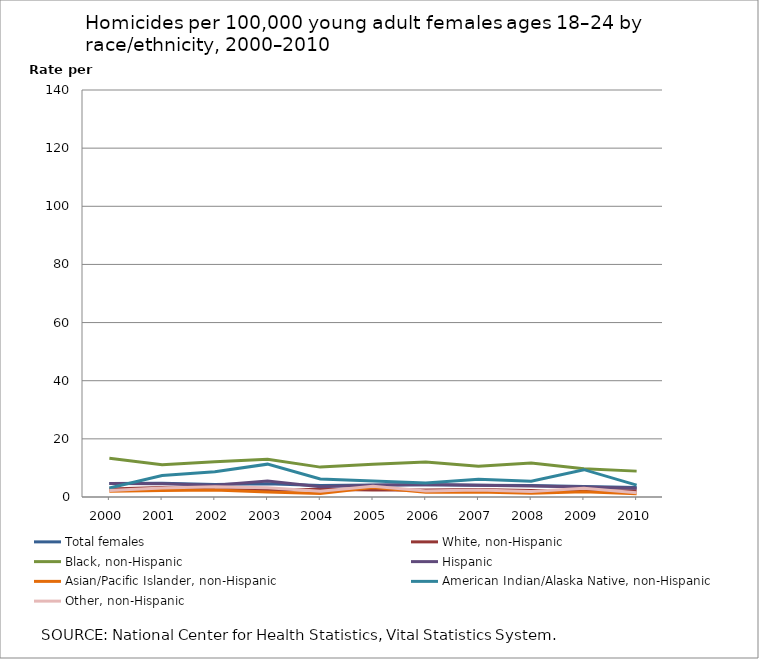
| Category | Total females | White, non-Hispanic | Black, non-Hispanic | Hispanic | Asian/Pacific Islander, non-Hispanic | American Indian/Alaska Native, non-Hispanic | Other, non-Hispanic |
|---|---|---|---|---|---|---|---|
| 2000.0 | 4.63 | 2.76 | 13.32 | 4.66 | 2 | 3.1 | 2.2 |
| 2001.0 | 4.69 | 3.29 | 11.08 | 4.6 | 2.2 | 7.4 | 3.1 |
| 2002.0 | 4.31 | 2.61 | 12.09 | 4.03 | 2.4 | 8.7 | 3.5 |
| 2003.0 | 4.55 | 2.35 | 13 | 5.48 | 1.7 | 11.3 | 3.2 |
| 2004.0 | 3.94 | 2.69 | 10.28 | 3.53 | 1.2 | 6.2 | 2 |
| 2005.0 | 4.13 | 2.45 | 11.27 | 4.02 | 3.3 | 5.5 | 3.7 |
| 2006.0 | 4.19 | 2.45 | 12.05 | 4.32 | 1.6 | 4.8 | 2.1 |
| 2007.0 | 4.06 | 2.6 | 10.61 | 4.06 | 1.7 | 6.1 | 2.4 |
| 2008.0 | 3.94 | 2.23 | 11.69 | 3.76 | 1.3 | 5.4 | 1.9 |
| 2009.0 | 3.57 | 2.05 | 9.75 | 3.41 | 1.8 | 9.4 | 3 |
| 2010.0 | 3.3 | 2.11 | 8.9 | 3.04 | 1.1 | 4.1 | 1.5 |